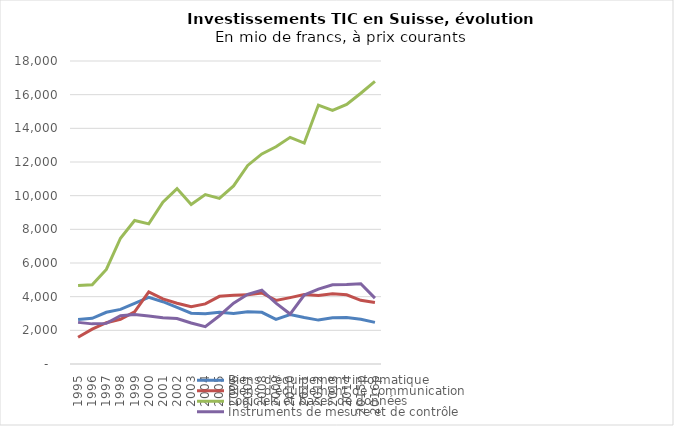
| Category | Biens d'équipement informatique  | Biens d'équipement de communication | Logiciels et bases de données | Instruments de mesure et de contrôle |
|---|---|---|---|---|
| 1995 | 2638.715 | 1586.177 | 4669.683 | 2472.926 |
| 1996 | 2713.05 | 2072.338 | 4701.253 | 2384.095 |
| 1997 | 3072.263 | 2454.237 | 5619.195 | 2413.143 |
| 1998 | 3245.486 | 2658.613 | 7471.429 | 2869.376 |
| 1999 | 3603.904 | 3101.951 | 8522.717 | 2935.638 |
| 2000 | 3961.237 | 4288.079 | 8323.201 | 2852.265 |
| 2001 | 3699.586 | 3865.747 | 9607.328 | 2749.801 |
| 2002 | 3364.919 | 3608.268 | 10420.987 | 2703.968 |
| 2003 | 3021.492 | 3396.94 | 9471.033 | 2432.674 |
| 2004 | 2990.672 | 3572.754 | 10061.774 | 2216.841 |
| 2005 | 3079.185 | 4019.889 | 9836.945 | 2868.127 |
| 2006 | 3001.498 | 4078.842 | 10577.055 | 3609.094 |
| 2007 | 3098.338 | 4106.537 | 11796.157 | 4141.045 |
| 2008 | 3069.001 | 4221.438 | 12477.708 | 4392.255 |
| 2009 | 2650.793 | 3776.615 | 12902.19 | 3616.801 |
| 2010 | 2935.433 | 3942.962 | 13464.967 | 2968.816 |
| 2011 | 2761.334 | 4121.316 | 13122.693 | 4094.486 |
| 2012 | 2607.825 | 4066.475 | 15380.678 | 4450.07 |
| 2013 | 2750.773 | 4167.093 | 15068.866 | 4704.783 |
| 2014 | 2762.014 | 4108.835 | 15425.608 | 4721.652 |
| 2015p | 2658.733 | 3782.591 | 16084.285 | 4771.68 |
| 2016p | 2474.403 | 3647.811 | 16785.285 | 3914.218 |